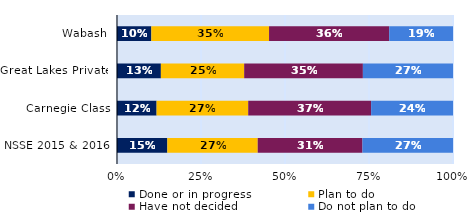
| Category | Done or in progress | Plan to do | Have not decided | Do not plan to do |
|---|---|---|---|---|
| Wabash | 0.102 | 0.35 | 0.358 | 0.19 |
| Great Lakes Private | 0.131 | 0.248 | 0.353 | 0.268 |
| Carnegie Class | 0.118 | 0.273 | 0.366 | 0.244 |
| NSSE 2015 & 2016 | 0.15 | 0.269 | 0.312 | 0.269 |